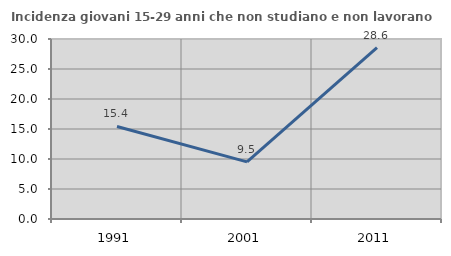
| Category | Incidenza giovani 15-29 anni che non studiano e non lavorano  |
|---|---|
| 1991.0 | 15.427 |
| 2001.0 | 9.524 |
| 2011.0 | 28.571 |